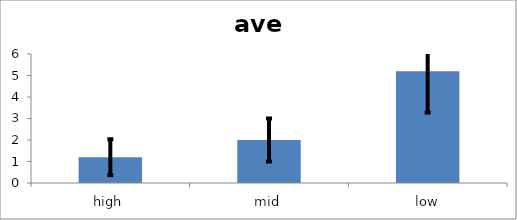
| Category | ave |
|---|---|
| high | 1.2 |
| mid | 2 |
| low | 5.2 |